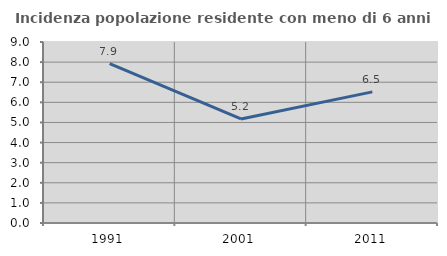
| Category | Incidenza popolazione residente con meno di 6 anni |
|---|---|
| 1991.0 | 7.926 |
| 2001.0 | 5.172 |
| 2011.0 | 6.52 |